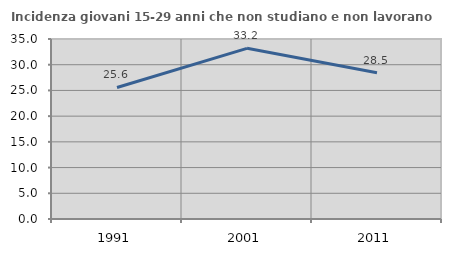
| Category | Incidenza giovani 15-29 anni che non studiano e non lavorano  |
|---|---|
| 1991.0 | 25.581 |
| 2001.0 | 33.188 |
| 2011.0 | 28.454 |